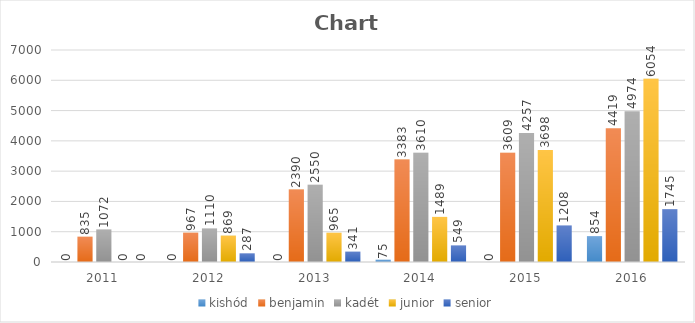
| Category | kishód | benjamin | kadét | junior | senior |
|---|---|---|---|---|---|
| 2011 | 0 | 835 | 1072 | 0 | 0 |
| 2012 | 0 | 967 | 1110 | 869 | 287 |
| 2013 | 0 | 2390 | 2550 | 965 | 341 |
| 2014 | 75 | 3383 | 3610 | 1489 | 549 |
| 2015 | 0 | 3609 | 4257 | 3698 | 1208 |
| 2016 | 854 | 4419 | 4974 | 6054 | 1745 |